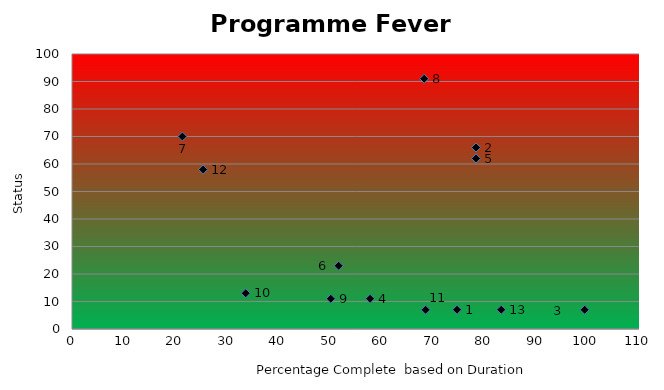
| Category | Project Fever Chart |
|---|---|
| 74.6938775510204 | 7 |
| 78.3882783882784 | 66 |
| 99.45652173913044 | 7 |
| 57.81990521327014 | 11 |
| 78.3882783882784 | 62 |
| 25.44642857142857 | 58 |
| 21.41176470588235 | 70 |
| 68.32460732984293 | 91 |
| 50.20576131687243 | 11 |
| 33.70786516853933 | 13 |
| 68.58974358974359 | 7 |
| 51.724137931034484 | 23 |
| 83.26848249027238 | 7 |